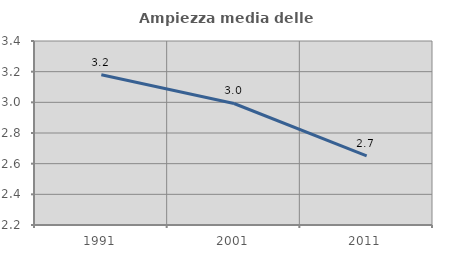
| Category | Ampiezza media delle famiglie |
|---|---|
| 1991.0 | 3.18 |
| 2001.0 | 2.992 |
| 2011.0 | 2.651 |